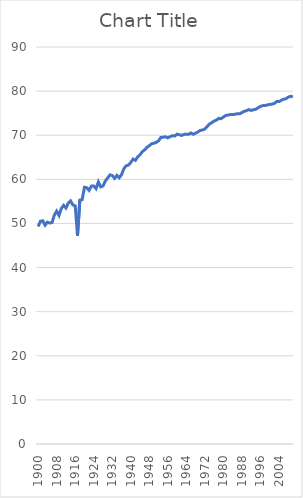
| Category | Series 0 |
|---|---|
| 1900.0 | 49.3 |
| 1901.0 | 50.5 |
| 1902.0 | 50.6 |
| 1903.0 | 49.6 |
| 1904.0 | 50.3 |
| 1905.0 | 50.1 |
| 1906.0 | 50.2 |
| 1907.0 | 51.9 |
| 1908.0 | 52.8 |
| 1909.0 | 51.8 |
| 1910.0 | 53.4 |
| 1911.0 | 54.1 |
| 1912.0 | 53.5 |
| 1913.0 | 54.6 |
| 1914.0 | 55.1 |
| 1915.0 | 54.2 |
| 1916.0 | 54 |
| 1917.0 | 47.2 |
| 1918.0 | 55.3 |
| 1919.0 | 55.4 |
| 1920.0 | 58.2 |
| 1921.0 | 58.1 |
| 1922.0 | 57.5 |
| 1923.0 | 58.5 |
| 1924.0 | 58.5 |
| 1925.0 | 57.9 |
| 1926.0 | 59.4 |
| 1927.0 | 58.3 |
| 1928.0 | 58.5 |
| 1929.0 | 59.6 |
| 1930.0 | 60.3 |
| 1931.0 | 61 |
| 1932.0 | 60.88 |
| 1933.0 | 60.23 |
| 1934.0 | 60.89 |
| 1935.0 | 60.35 |
| 1936.0 | 61.05 |
| 1937.0 | 62.39 |
| 1938.0 | 63.07 |
| 1939.0 | 63.23 |
| 1940.0 | 63.8 |
| 1941.0 | 64.59 |
| 1942.0 | 64.3 |
| 1943.0 | 65.09 |
| 1944.0 | 65.58 |
| 1945.0 | 66.28 |
| 1946.0 | 66.69 |
| 1947.0 | 67.25 |
| 1948.0 | 67.63 |
| 1949.0 | 68.07 |
| 1950.0 | 68.17 |
| 1951.0 | 68.39 |
| 1952.0 | 68.72 |
| 1953.0 | 69.5 |
| 1954.0 | 69.56 |
| 1955.0 | 69.64 |
| 1956.0 | 69.41 |
| 1957.0 | 69.67 |
| 1958.0 | 69.89 |
| 1959.0 | 69.83 |
| 1960.0 | 70.24 |
| 1961.0 | 70.11 |
| 1962.0 | 69.94 |
| 1963.0 | 70.19 |
| 1964.0 | 70.24 |
| 1965.0 | 70.21 |
| 1966.0 | 70.52 |
| 1967.0 | 70.22 |
| 1968.0 | 70.48 |
| 1969.0 | 70.74 |
| 1970.0 | 71.09 |
| 1971.0 | 71.18 |
| 1972.0 | 71.4 |
| 1973.0 | 71.97 |
| 1974.0 | 72.54 |
| 1975.0 | 72.85 |
| 1976.0 | 73.22 |
| 1977.0 | 73.42 |
| 1978.0 | 73.83 |
| 1979.0 | 73.74 |
| 1980.0 | 74.12 |
| 1981.0 | 74.47 |
| 1982.0 | 74.56 |
| 1983.0 | 74.69 |
| 1984.0 | 74.67 |
| 1985.0 | 74.75 |
| 1986.0 | 74.88 |
| 1987.0 | 74.86 |
| 1988.0 | 75.14 |
| 1989.0 | 75.41 |
| 1990.0 | 75.56 |
| 1991.0 | 75.81 |
| 1992.0 | 75.61 |
| 1993.0 | 75.78 |
| 1994.0 | 75.89 |
| 1995.0 | 76.22 |
| 1996.0 | 76.54 |
| 1997.0 | 76.71 |
| 1998.0 | 76.73 |
| 1999.0 | 76.87 |
| 2000.0 | 76.98 |
| 2001.0 | 77.05 |
| 2002.0 | 77.21 |
| 2003.0 | 77.62 |
| 2004.0 | 77.62 |
| 2005.0 | 77.91 |
| 2006.0 | 78.17 |
| 2007.0 | 78.26 |
| 2008.0 | 78.63 |
| 2009.0 | 78.83 |
| 2010.0 | 78.7 |